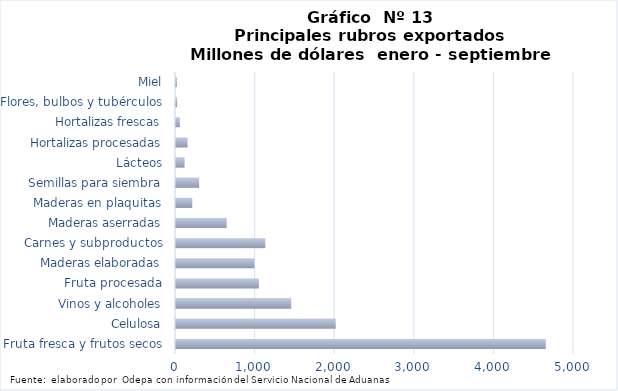
| Category | Series 7 |
|---|---|
| Fruta fresca y frutos secos | 4645719.238 |
| Celulosa | 2006860.062 |
| Vinos y alcoholes | 1447420.758 |
| Fruta procesada | 1042028.579 |
| Maderas elaboradas | 985525.936 |
| Carnes y subproductos | 1122246.395 |
| Maderas aserradas | 636045.32 |
| Maderas en plaquitas | 204613.888 |
| Semillas para siembra | 291176.934 |
| Lácteos | 107736.019 |
| Hortalizas procesadas | 145372.931 |
| Hortalizas frescas | 47943.314 |
| Flores, bulbos y tubérculos | 14481.51 |
| Miel | 11177.927 |